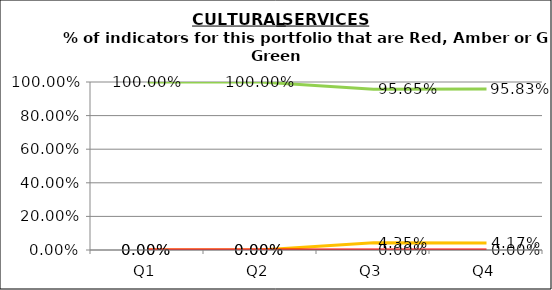
| Category | Green | Amber | Red |
|---|---|---|---|
| Q1 | 1 | 0 | 0 |
| Q2 | 1 | 0 | 0 |
| Q3 | 0.957 | 0.043 | 0 |
| Q4 | 0.958 | 0.042 | 0 |